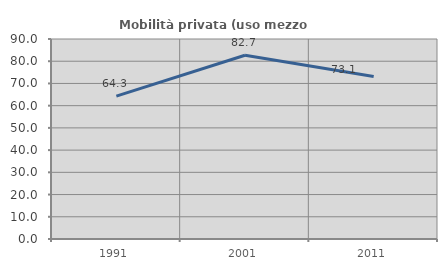
| Category | Mobilità privata (uso mezzo privato) |
|---|---|
| 1991.0 | 64.286 |
| 2001.0 | 82.692 |
| 2011.0 | 73.118 |